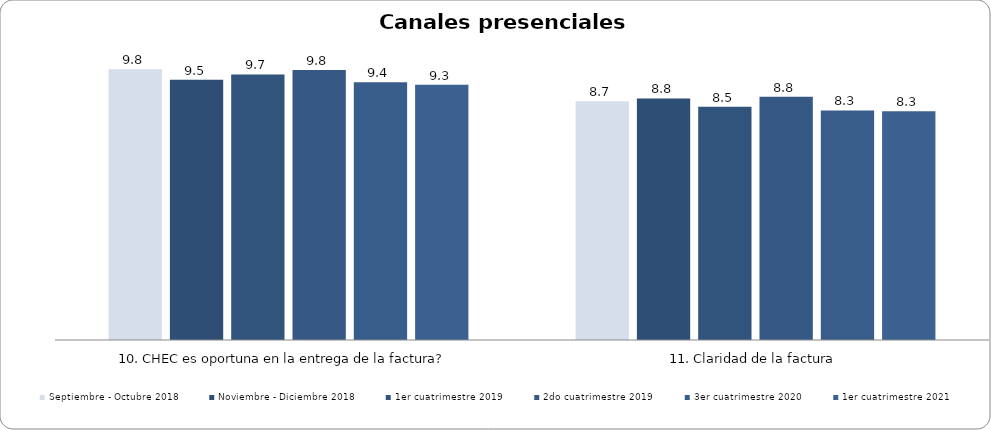
| Category | Septiembre - Octubre 2018 | Noviembre - Diciembre 2018 | 1er cuatrimestre 2019 | 2do cuatrimestre 2019 | 3er cuatrimestre 2020 | 1er cuatrimestre 2021 |
|---|---|---|---|---|---|---|
| 10. CHEC es oportuna en la entrega de la factura? | 9.848 | 9.459 | 9.655 | 9.817 | 9.375 | 9.286 |
| 11. Claridad de la factura | 8.685 | 8.784 | 8.479 | 8.842 | 8.348 | 8.321 |